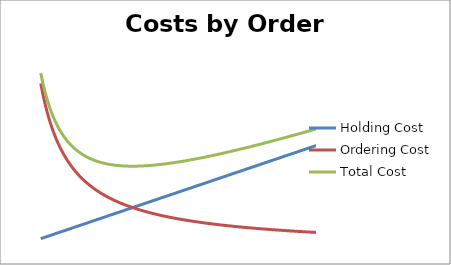
| Category | Holding Cost | Ordering Cost | Total Cost |
|---|---|---|---|
| 100.0 | 12.5 | 200 | 212.5 |
| 105.0 | 13.125 | 190.476 | 203.601 |
| 110.0 | 13.75 | 181.818 | 195.568 |
| 115.0 | 14.375 | 173.913 | 188.288 |
| 120.0 | 15 | 166.667 | 181.667 |
| 125.0 | 15.625 | 160 | 175.625 |
| 130.0 | 16.25 | 153.846 | 170.096 |
| 135.0 | 16.875 | 148.148 | 165.023 |
| 140.0 | 17.5 | 142.857 | 160.357 |
| 145.0 | 18.125 | 137.931 | 156.056 |
| 150.0 | 18.75 | 133.333 | 152.083 |
| 155.0 | 19.375 | 129.032 | 148.407 |
| 160.0 | 20 | 125 | 145 |
| 165.0 | 20.625 | 121.212 | 141.837 |
| 170.0 | 21.25 | 117.647 | 138.897 |
| 175.0 | 21.875 | 114.286 | 136.161 |
| 180.0 | 22.5 | 111.111 | 133.611 |
| 185.0 | 23.125 | 108.108 | 131.233 |
| 190.0 | 23.75 | 105.263 | 129.013 |
| 195.0 | 24.375 | 102.564 | 126.939 |
| 200.0 | 25 | 100 | 125 |
| 205.0 | 25.625 | 97.561 | 123.186 |
| 210.0 | 26.25 | 95.238 | 121.488 |
| 215.0 | 26.875 | 93.023 | 119.898 |
| 220.0 | 27.5 | 90.909 | 118.409 |
| 225.0 | 28.125 | 88.889 | 117.014 |
| 230.0 | 28.75 | 86.957 | 115.707 |
| 235.0 | 29.375 | 85.106 | 114.481 |
| 240.0 | 30 | 83.333 | 113.333 |
| 245.0 | 30.625 | 81.633 | 112.258 |
| 250.0 | 31.25 | 80 | 111.25 |
| 255.0 | 31.875 | 78.431 | 110.306 |
| 260.0 | 32.5 | 76.923 | 109.423 |
| 265.0 | 33.125 | 75.472 | 108.597 |
| 270.0 | 33.75 | 74.074 | 107.824 |
| 275.0 | 34.375 | 72.727 | 107.102 |
| 280.0 | 35 | 71.429 | 106.429 |
| 285.0 | 35.625 | 70.175 | 105.8 |
| 290.0 | 36.25 | 68.966 | 105.216 |
| 295.0 | 36.875 | 67.797 | 104.672 |
| 300.0 | 37.5 | 66.667 | 104.167 |
| 305.0 | 38.125 | 65.574 | 103.699 |
| 310.0 | 38.75 | 64.516 | 103.266 |
| 315.0 | 39.375 | 63.492 | 102.867 |
| 320.0 | 40 | 62.5 | 102.5 |
| 325.0 | 40.625 | 61.538 | 102.163 |
| 330.0 | 41.25 | 60.606 | 101.856 |
| 335.0 | 41.875 | 59.701 | 101.576 |
| 340.0 | 42.5 | 58.824 | 101.324 |
| 345.0 | 43.125 | 57.971 | 101.096 |
| 350.0 | 43.75 | 57.143 | 100.893 |
| 355.0 | 44.375 | 56.338 | 100.713 |
| 360.0 | 45 | 55.556 | 100.556 |
| 365.0 | 45.625 | 54.795 | 100.42 |
| 370.0 | 46.25 | 54.054 | 100.304 |
| 375.0 | 46.875 | 53.333 | 100.208 |
| 380.0 | 47.5 | 52.632 | 100.132 |
| 385.0 | 48.125 | 51.948 | 100.073 |
| 390.0 | 48.75 | 51.282 | 100.032 |
| 395.0 | 49.375 | 50.633 | 100.008 |
| 400.0 | 50 | 50 | 100 |
| 405.0 | 50.625 | 49.383 | 100.008 |
| 410.0 | 51.25 | 48.78 | 100.03 |
| 415.0 | 51.875 | 48.193 | 100.068 |
| 420.0 | 52.5 | 47.619 | 100.119 |
| 425.0 | 53.125 | 47.059 | 100.184 |
| 430.0 | 53.75 | 46.512 | 100.262 |
| 435.0 | 54.375 | 45.977 | 100.352 |
| 440.0 | 55 | 45.455 | 100.455 |
| 445.0 | 55.625 | 44.944 | 100.569 |
| 450.0 | 56.25 | 44.444 | 100.694 |
| 455.0 | 56.875 | 43.956 | 100.831 |
| 460.0 | 57.5 | 43.478 | 100.978 |
| 465.0 | 58.125 | 43.011 | 101.136 |
| 470.0 | 58.75 | 42.553 | 101.303 |
| 475.0 | 59.375 | 42.105 | 101.48 |
| 480.0 | 60 | 41.667 | 101.667 |
| 485.0 | 60.625 | 41.237 | 101.862 |
| 490.0 | 61.25 | 40.816 | 102.066 |
| 495.0 | 61.875 | 40.404 | 102.279 |
| 500.0 | 62.5 | 40 | 102.5 |
| 505.0 | 63.125 | 39.604 | 102.729 |
| 510.0 | 63.75 | 39.216 | 102.966 |
| 515.0 | 64.375 | 38.835 | 103.21 |
| 520.0 | 65 | 38.462 | 103.462 |
| 525.0 | 65.625 | 38.095 | 103.72 |
| 530.0 | 66.25 | 37.736 | 103.986 |
| 535.0 | 66.875 | 37.383 | 104.258 |
| 540.0 | 67.5 | 37.037 | 104.537 |
| 545.0 | 68.125 | 36.697 | 104.822 |
| 550.0 | 68.75 | 36.364 | 105.114 |
| 555.0 | 69.375 | 36.036 | 105.411 |
| 560.0 | 70 | 35.714 | 105.714 |
| 565.0 | 70.625 | 35.398 | 106.023 |
| 570.0 | 71.25 | 35.088 | 106.338 |
| 575.0 | 71.875 | 34.783 | 106.658 |
| 580.0 | 72.5 | 34.483 | 106.983 |
| 585.0 | 73.125 | 34.188 | 107.313 |
| 590.0 | 73.75 | 33.898 | 107.648 |
| 595.0 | 74.375 | 33.613 | 107.988 |
| 600.0 | 75 | 33.333 | 108.333 |
| 605.0 | 75.625 | 33.058 | 108.683 |
| 610.0 | 76.25 | 32.787 | 109.037 |
| 615.0 | 76.875 | 32.52 | 109.395 |
| 620.0 | 77.5 | 32.258 | 109.758 |
| 625.0 | 78.125 | 32 | 110.125 |
| 630.0 | 78.75 | 31.746 | 110.496 |
| 635.0 | 79.375 | 31.496 | 110.871 |
| 640.0 | 80 | 31.25 | 111.25 |
| 645.0 | 80.625 | 31.008 | 111.633 |
| 650.0 | 81.25 | 30.769 | 112.019 |
| 655.0 | 81.875 | 30.534 | 112.409 |
| 660.0 | 82.5 | 30.303 | 112.803 |
| 665.0 | 83.125 | 30.075 | 113.2 |
| 670.0 | 83.75 | 29.851 | 113.601 |
| 675.0 | 84.375 | 29.63 | 114.005 |
| 680.0 | 85 | 29.412 | 114.412 |
| 685.0 | 85.625 | 29.197 | 114.822 |
| 690.0 | 86.25 | 28.986 | 115.236 |
| 695.0 | 86.875 | 28.777 | 115.652 |
| 700.0 | 87.5 | 28.571 | 116.071 |
| 705.0 | 88.125 | 28.369 | 116.494 |
| 710.0 | 88.75 | 28.169 | 116.919 |
| 715.0 | 89.375 | 27.972 | 117.347 |
| 720.0 | 90 | 27.778 | 117.778 |
| 725.0 | 90.625 | 27.586 | 118.211 |
| 730.0 | 91.25 | 27.397 | 118.647 |
| 735.0 | 91.875 | 27.211 | 119.086 |
| 740.0 | 92.5 | 27.027 | 119.527 |
| 745.0 | 93.125 | 26.846 | 119.971 |
| 750.0 | 93.75 | 26.667 | 120.417 |
| 755.0 | 94.375 | 26.49 | 120.865 |
| 760.0 | 95 | 26.316 | 121.316 |
| 765.0 | 95.625 | 26.144 | 121.769 |
| 770.0 | 96.25 | 25.974 | 122.224 |
| 775.0 | 96.875 | 25.806 | 122.681 |
| 780.0 | 97.5 | 25.641 | 123.141 |
| 785.0 | 98.125 | 25.478 | 123.603 |
| 790.0 | 98.75 | 25.316 | 124.066 |
| 795.0 | 99.375 | 25.157 | 124.532 |
| 800.0 | 100 | 25 | 125 |
| 805.0 | 100.625 | 24.845 | 125.47 |
| 810.0 | 101.25 | 24.691 | 125.941 |
| 815.0 | 101.875 | 24.54 | 126.415 |
| 820.0 | 102.5 | 24.39 | 126.89 |
| 825.0 | 103.125 | 24.242 | 127.367 |
| 830.0 | 103.75 | 24.096 | 127.846 |
| 835.0 | 104.375 | 23.952 | 128.327 |
| 840.0 | 105 | 23.81 | 128.81 |
| 845.0 | 105.625 | 23.669 | 129.294 |
| 850.0 | 106.25 | 23.529 | 129.779 |
| 855.0 | 106.875 | 23.392 | 130.267 |
| 860.0 | 107.5 | 23.256 | 130.756 |
| 865.0 | 108.125 | 23.121 | 131.246 |
| 870.0 | 108.75 | 22.989 | 131.739 |
| 875.0 | 109.375 | 22.857 | 132.232 |
| 880.0 | 110 | 22.727 | 132.727 |
| 885.0 | 110.625 | 22.599 | 133.224 |
| 890.0 | 111.25 | 22.472 | 133.722 |
| 895.0 | 111.875 | 22.346 | 134.221 |
| 900.0 | 112.5 | 22.222 | 134.722 |
| 905.0 | 113.125 | 22.099 | 135.224 |
| 910.0 | 113.75 | 21.978 | 135.728 |
| 915.0 | 114.375 | 21.858 | 136.233 |
| 920.0 | 115 | 21.739 | 136.739 |
| 925.0 | 115.625 | 21.622 | 137.247 |
| 930.0 | 116.25 | 21.505 | 137.755 |
| 935.0 | 116.875 | 21.39 | 138.265 |
| 940.0 | 117.5 | 21.277 | 138.777 |
| 945.0 | 118.125 | 21.164 | 139.289 |
| 950.0 | 118.75 | 21.053 | 139.803 |
| 955.0 | 119.375 | 20.942 | 140.317 |
| 960.0 | 120 | 20.833 | 140.833 |
| 965.0 | 120.625 | 20.725 | 141.35 |
| 970.0 | 121.25 | 20.619 | 141.869 |
| 975.0 | 121.875 | 20.513 | 142.388 |
| 980.0 | 122.5 | 20.408 | 142.908 |
| 985.0 | 123.125 | 20.305 | 143.43 |
| 990.0 | 123.75 | 20.202 | 143.952 |
| 995.0 | 124.375 | 20.101 | 144.476 |
| 1000.0 | 125 | 20 | 145 |